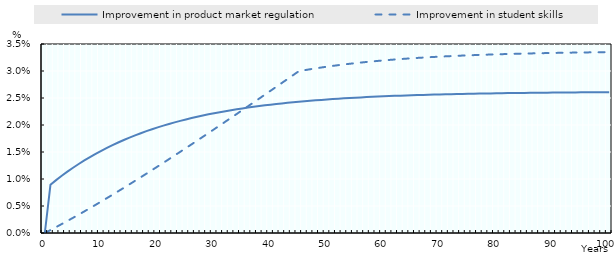
| Category | Improvement in product market regulation | Improvement in student skills |
|---|---|---|
| 0.0 | 0 | 0 |
| 1.0 | 0.009 | 0.001 |
| 2.0 | 0.01 | 0.001 |
| 3.0 | 0.011 | 0.002 |
| 4.0 | 0.011 | 0.002 |
| 5.0 | 0.012 | 0.003 |
| 6.0 | 0.013 | 0.003 |
| 7.0 | 0.013 | 0.004 |
| 8.0 | 0.014 | 0.005 |
| 9.0 | 0.015 | 0.005 |
| 10.0 | 0.015 | 0.006 |
| 11.0 | 0.016 | 0.006 |
| 12.0 | 0.016 | 0.007 |
| 13.0 | 0.017 | 0.008 |
| 14.0 | 0.017 | 0.008 |
| 15.0 | 0.018 | 0.009 |
| 16.0 | 0.018 | 0.01 |
| 17.0 | 0.018 | 0.01 |
| 18.0 | 0.019 | 0.011 |
| 19.0 | 0.019 | 0.012 |
| 20.0 | 0.02 | 0.012 |
| 21.0 | 0.02 | 0.013 |
| 22.0 | 0.02 | 0.014 |
| 23.0 | 0.02 | 0.014 |
| 24.0 | 0.021 | 0.015 |
| 25.0 | 0.021 | 0.016 |
| 26.0 | 0.021 | 0.016 |
| 27.0 | 0.022 | 0.017 |
| 28.0 | 0.022 | 0.018 |
| 29.0 | 0.022 | 0.019 |
| 30.0 | 0.022 | 0.019 |
| 31.0 | 0.022 | 0.02 |
| 32.0 | 0.023 | 0.021 |
| 33.0 | 0.023 | 0.021 |
| 34.0 | 0.023 | 0.022 |
| 35.0 | 0.023 | 0.023 |
| 36.0 | 0.023 | 0.023 |
| 37.0 | 0.023 | 0.024 |
| 38.0 | 0.024 | 0.025 |
| 39.0 | 0.024 | 0.026 |
| 40.0 | 0.024 | 0.026 |
| 41.0 | 0.024 | 0.027 |
| 42.0 | 0.024 | 0.028 |
| 43.0 | 0.024 | 0.029 |
| 44.0 | 0.024 | 0.029 |
| 45.0 | 0.024 | 0.03 |
| 46.0 | 0.024 | 0.03 |
| 47.0 | 0.024 | 0.03 |
| 48.0 | 0.025 | 0.03 |
| 49.0 | 0.025 | 0.031 |
| 50.0 | 0.025 | 0.031 |
| 51.0 | 0.025 | 0.031 |
| 52.0 | 0.025 | 0.031 |
| 53.0 | 0.025 | 0.031 |
| 54.0 | 0.025 | 0.031 |
| 55.0 | 0.025 | 0.031 |
| 56.0 | 0.025 | 0.032 |
| 57.0 | 0.025 | 0.032 |
| 58.0 | 0.025 | 0.032 |
| 59.0 | 0.025 | 0.032 |
| 60.0 | 0.025 | 0.032 |
| 61.0 | 0.025 | 0.032 |
| 62.0 | 0.025 | 0.032 |
| 63.0 | 0.025 | 0.032 |
| 64.0 | 0.025 | 0.032 |
| 65.0 | 0.026 | 0.032 |
| 66.0 | 0.026 | 0.032 |
| 67.0 | 0.026 | 0.032 |
| 68.0 | 0.026 | 0.033 |
| 69.0 | 0.026 | 0.033 |
| 70.0 | 0.026 | 0.033 |
| 71.0 | 0.026 | 0.033 |
| 72.0 | 0.026 | 0.033 |
| 73.0 | 0.026 | 0.033 |
| 74.0 | 0.026 | 0.033 |
| 75.0 | 0.026 | 0.033 |
| 76.0 | 0.026 | 0.033 |
| 77.0 | 0.026 | 0.033 |
| 78.0 | 0.026 | 0.033 |
| 79.0 | 0.026 | 0.033 |
| 80.0 | 0.026 | 0.033 |
| 81.0 | 0.026 | 0.033 |
| 82.0 | 0.026 | 0.033 |
| 83.0 | 0.026 | 0.033 |
| 84.0 | 0.026 | 0.033 |
| 85.0 | 0.026 | 0.033 |
| 86.0 | 0.026 | 0.033 |
| 87.0 | 0.026 | 0.033 |
| 88.0 | 0.026 | 0.033 |
| 89.0 | 0.026 | 0.033 |
| 90.0 | 0.026 | 0.033 |
| 91.0 | 0.026 | 0.033 |
| 92.0 | 0.026 | 0.033 |
| 93.0 | 0.026 | 0.033 |
| 94.0 | 0.026 | 0.033 |
| 95.0 | 0.026 | 0.033 |
| 96.0 | 0.026 | 0.033 |
| 97.0 | 0.026 | 0.033 |
| 98.0 | 0.026 | 0.033 |
| 99.0 | 0.026 | 0.033 |
| 100.0 | 0.026 | 0.033 |